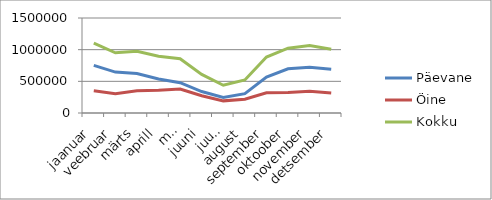
| Category | Päevane | Öine | Kokku |
|---|---|---|---|
| jaanuar | 752754.7 | 350585.1 | 1103339.8 |
| veebruar | 646357.9 | 304672.3 | 951030.2 |
| märts | 623465.5 | 351714.3 | 975179.8 |
| aprill | 537875.4 | 359630.9 | 897506.3 |
| mai | 479017.8 | 377662.9 | 856680.7 |
| juuni | 338656.1 | 271737.4 | 610393.5 |
| juuli | 246126.7 | 191610.3 | 437737 |
| august | 304617.5 | 217170.1 | 521787.6 |
| september | 565652.9 | 318469.4 | 884122.3 |
| oktoober | 697844.6 | 325220.5 | 1023065.1 |
| november | 720737 | 344523.4 | 1065260.4 |
| detsember | 691501.3 | 314259.4 | 1005760.7 |